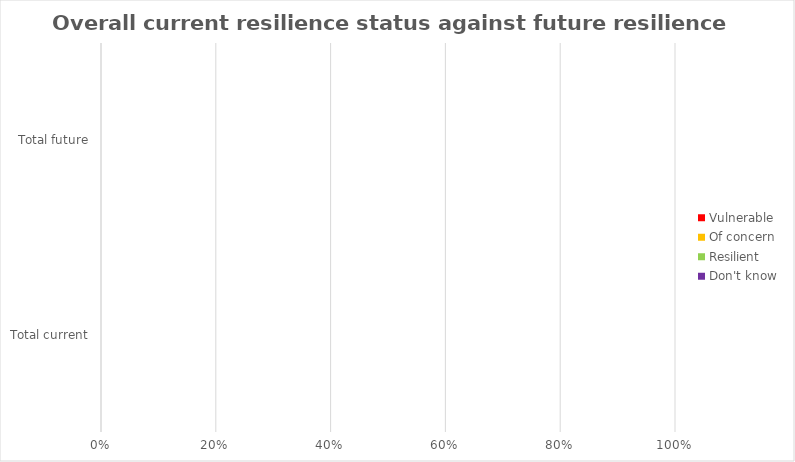
| Category | Vulnerable | Of concern | Resilient | Don't know |
|---|---|---|---|---|
| Total current | 0 | 0 | 0 | 0 |
| Total future | 0 | 0 | 0 | 0 |